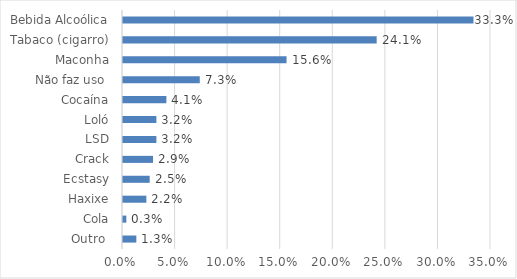
| Category | Series 0 |
|---|---|
| Outro  | 0.013 |
| Cola | 0.003 |
| Haxixe | 0.022 |
| Ecstasy | 0.025 |
| Crack | 0.029 |
| LSD | 0.032 |
| Loló | 0.032 |
| Cocaína | 0.041 |
| Não faz uso  | 0.073 |
| Maconha | 0.156 |
| Tabaco (cigarro) | 0.241 |
| Bebida Alcoólica | 0.333 |